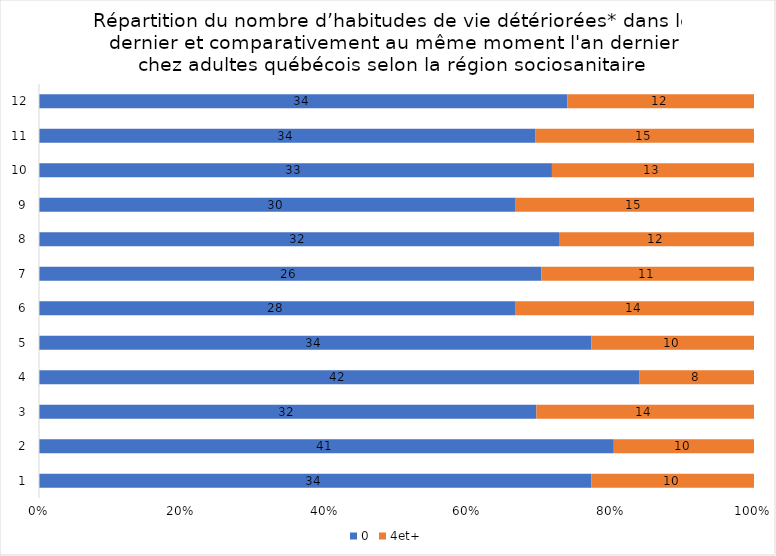
| Category | 0 | 4et+ |
|---|---|---|
| 0 | 34 | 10 |
| 1 | 41 | 10 |
| 2 | 32 | 14 |
| 3 | 42 | 8 |
| 4 | 34 | 10 |
| 5 | 28 | 14 |
| 6 | 26 | 11 |
| 7 | 32 | 12 |
| 8 | 30 | 15 |
| 9 | 33 | 13 |
| 10 | 34 | 15 |
| 11 | 34 | 12 |